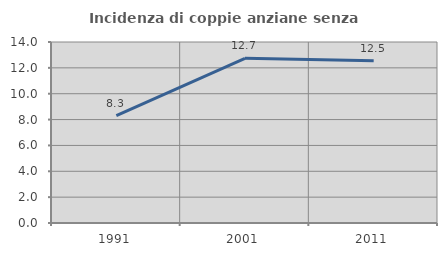
| Category | Incidenza di coppie anziane senza figli  |
|---|---|
| 1991.0 | 8.302 |
| 2001.0 | 12.741 |
| 2011.0 | 12.548 |